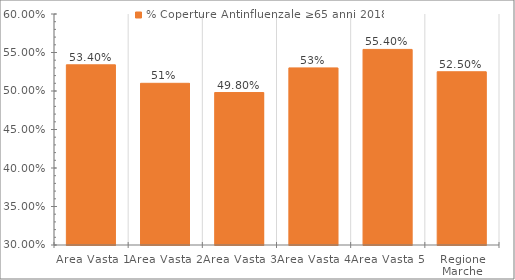
| Category | % Coperture Antinfluenzale ≥65 anni 2018 |
|---|---|
| Area Vasta 1  | 0.534 |
| Area Vasta 2 | 0.51 |
| Area Vasta 3 | 0.498 |
| Area Vasta 4 | 0.53 |
| Area Vasta 5 | 0.554 |
| Regione Marche | 0.525 |